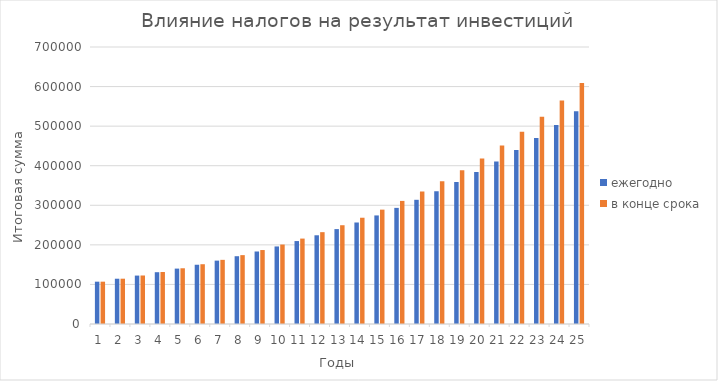
| Category | ежегодно | в конце срока |
|---|---|---|
| 0 | 106960 | 106960 |
| 1 | 114404.416 | 114476.8 |
| 2 | 122366.963 | 122594.944 |
| 3 | 130883.704 | 131362.54 |
| 4 | 139993.21 | 140831.543 |
| 5 | 149736.737 | 151058.066 |
| 6 | 160158.414 | 162102.711 |
| 7 | 171305.44 | 174030.928 |
| 8 | 183228.298 | 186913.403 |
| 9 | 195980.988 | 200826.475 |
| 10 | 209621.265 | 215852.593 |
| 11 | 224210.905 | 232080.8 |
| 12 | 239815.984 | 249607.264 |
| 13 | 256507.176 | 268535.845 |
| 14 | 274360.076 | 288978.713 |
| 15 | 293455.537 | 311057.01 |
| 16 | 313880.042 | 334901.571 |
| 17 | 335726.093 | 360653.696 |
| 18 | 359092.629 | 388465.992 |
| 19 | 384085.476 | 418503.272 |
| 20 | 410817.825 | 450943.533 |
| 21 | 439410.746 | 485979.016 |
| 22 | 469993.734 | 523817.337 |
| 23 | 502705.298 | 564682.724 |
| 24 | 537693.587 | 608817.342 |